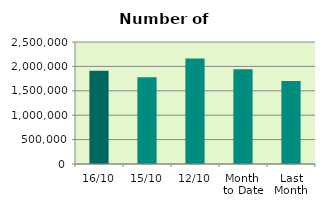
| Category | Series 0 |
|---|---|
| 16/10 | 1911494 |
| 15/10 | 1776010 |
| 12/10 | 2163920 |
| Month 
to Date | 1939957.833 |
| Last
Month | 1700207.9 |